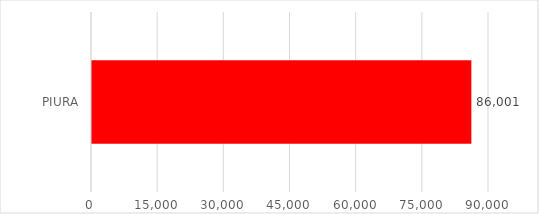
| Category | Series 0 |
|---|---|
| PIURA | 86001 |